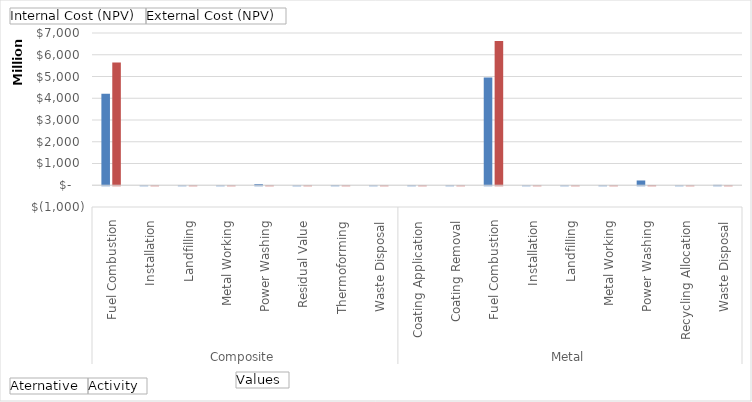
| Category | Internal Cost (NPV) | External Cost (NPV) |
|---|---|---|
| 0 | 4208850357.245 | 5640380453.188 |
| 1 | 48426.537 | 9700.955 |
| 2 | 417312.426 | 1243432.316 |
| 3 | 57520.615 | 43738.89 |
| 4 | 50640512.351 | 2900822.792 |
| 5 | -1635929.87 | -199573.443 |
| 6 | 9862223.294 | 1172046.242 |
| 7 | 122244.994 | 9995.658 |
| 8 | 4835016.416 | 1762612.319 |
| 9 | 3192389.24 | 599843.962 |
| 10 | 4951588655.582 | 6635741709.633 |
| 11 | 11022.529 | 1413.219 |
| 12 | 107024.485 | 320721.493 |
| 13 | 2222396.861 | 1650366.342 |
| 14 | 219442220.188 | 12569078.775 |
| 15 | -339670.764 | -142467.111 |
| 16 | 17041935.184 | 608493.501 |